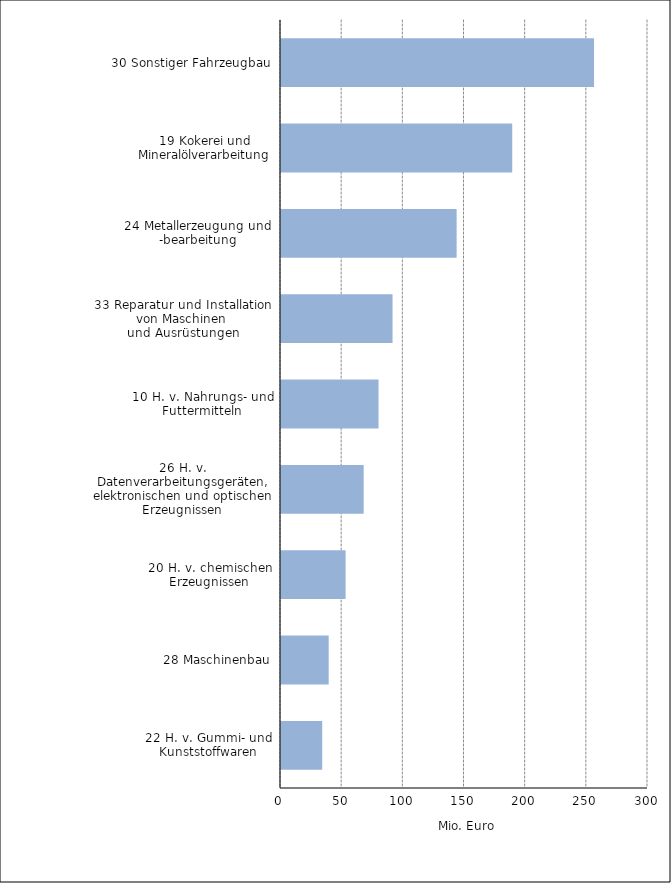
| Category | Mio. Euro |
|---|---|
| 30 Sonstiger Fahrzeugbau | 255.896 |
| 19 Kokerei und Mineralölverarbeitung | 189.017 |
| 24 Metallerzeugung und -bearbeitung | 143.557 |
| 33 Reparatur und Installation von Maschinen 
und Ausrüstungen | 91.18 |
| 10 H. v. Nahrungs- und Futtermitteln | 79.726 |
| 26 H. v. Datenverarbeitungsgeräten, elektronischen und optischen Erzeugnissen | 67.59 |
| 20 H. v. chemischen Erzeugnissen | 52.823 |
| 28 Maschinenbau | 38.976 |
| 22 H. v. Gummi- und Kunststoffwaren | 33.682 |